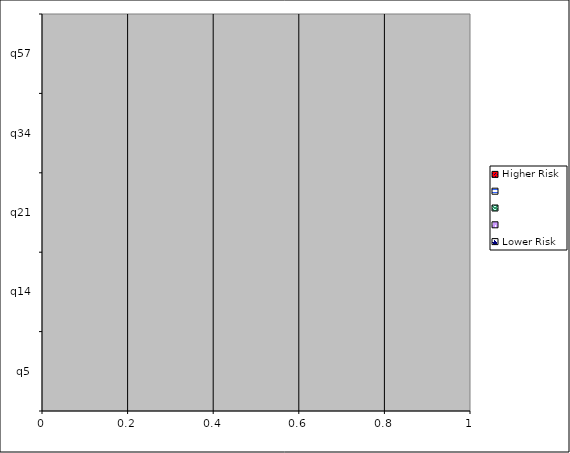
| Category | Higher Risk |   | Lower Risk |
|---|---|---|---|
| q5 | 0 | 0 | 0 |
| q14 | 0 | 0 | 0 |
| q21 | 0 | 0 | 0 |
| q34 | 0 | 0 | 0 |
| q57 | 0 | 0 | 0 |